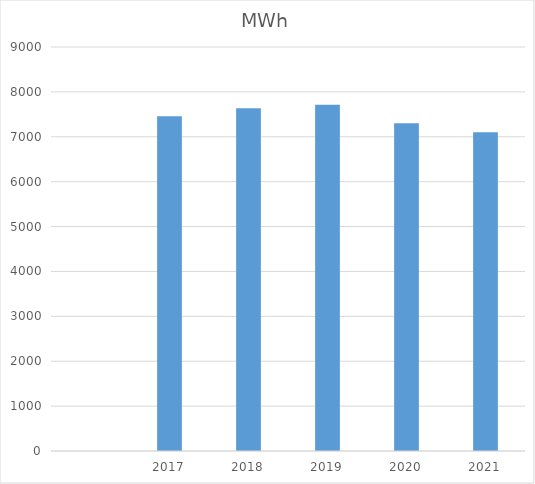
| Category | MWh |
|---|---|
| nan | 0 |
| 2017.0 | 7456.556 |
| 2018.0 | 7634.424 |
| 2019.0 | 7713.739 |
| 2020.0 | 7302.407 |
| 2021.0 | 7099.922 |